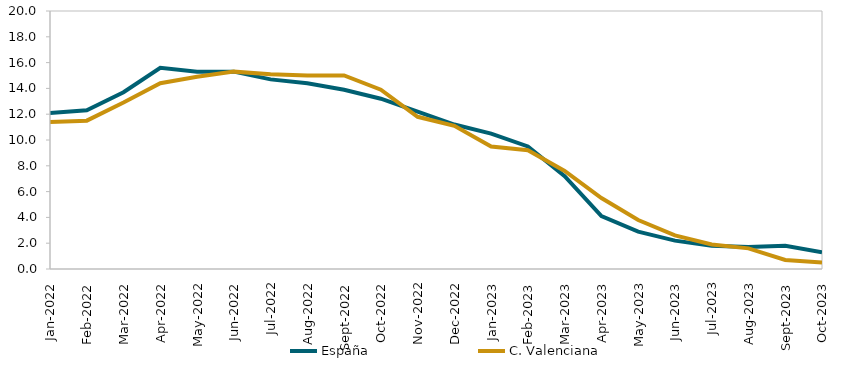
| Category | España | C. Valenciana |
|---|---|---|
| 2022-01-01 | 12.1 | 11.4 |
| 2022-02-01 | 12.3 | 11.5 |
| 2022-03-01 | 13.7 | 12.9 |
| 2022-04-01 | 15.6 | 14.4 |
| 2022-05-01 | 15.3 | 14.9 |
| 2022-06-01 | 15.3 | 15.3 |
| 2022-07-01 | 14.7 | 15.1 |
| 2022-08-01 | 14.4 | 15 |
| 2022-09-01 | 13.9 | 15 |
| 2022-10-01 | 13.2 | 13.9 |
| 2022-11-01 | 12.2 | 11.8 |
| 2022-12-01 | 11.2 | 11.1 |
| 2023-01-01 | 10.5 | 9.5 |
| 2023-02-01 | 9.5 | 9.2 |
| 2023-03-01 | 7.2 | 7.6 |
| 2023-04-01 | 4.1 | 5.5 |
| 2023-05-01 | 2.9 | 3.8 |
| 2023-06-01 | 2.2 | 2.6 |
| 2023-07-01 | 1.8 | 1.9 |
| 2023-08-01 | 1.7 | 1.6 |
| 2023-09-01 | 1.8 | 0.7 |
| 2023-10-01 | 1.3 | 0.5 |